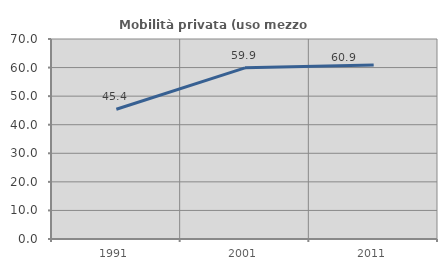
| Category | Mobilità privata (uso mezzo privato) |
|---|---|
| 1991.0 | 45.419 |
| 2001.0 | 59.894 |
| 2011.0 | 60.92 |